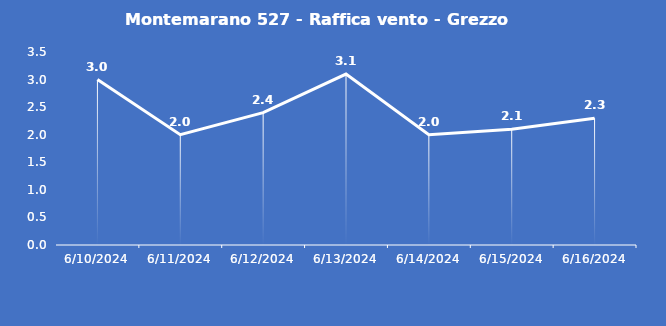
| Category | Montemarano 527 - Raffica vento - Grezzo (m/s) |
|---|---|
| 6/10/24 | 3 |
| 6/11/24 | 2 |
| 6/12/24 | 2.4 |
| 6/13/24 | 3.1 |
| 6/14/24 | 2 |
| 6/15/24 | 2.1 |
| 6/16/24 | 2.3 |